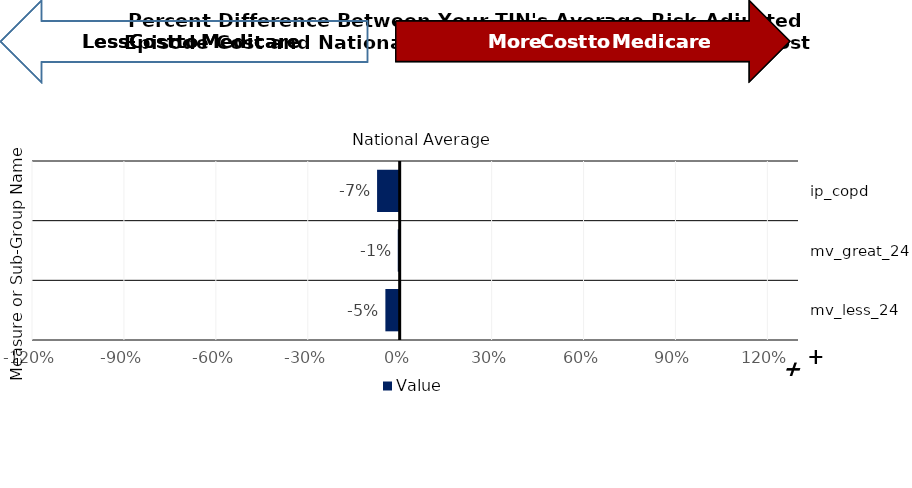
| Category | Value |
|---|---|
| ip_copd | -0.074 |
| mv_great_24 | -0.006 |
| mv_less_24 | -0.047 |